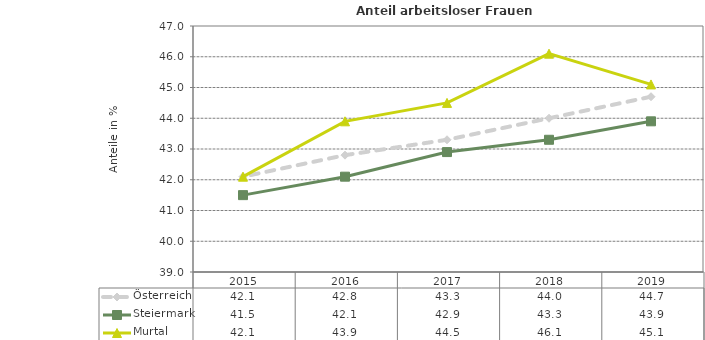
| Category | Österreich | Steiermark | Murtal |
|---|---|---|---|
| 2019.0 | 44.7 | 43.9 | 45.1 |
| 2018.0 | 44 | 43.3 | 46.1 |
| 2017.0 | 43.3 | 42.9 | 44.5 |
| 2016.0 | 42.8 | 42.1 | 43.9 |
| 2015.0 | 42.1 | 41.5 | 42.1 |